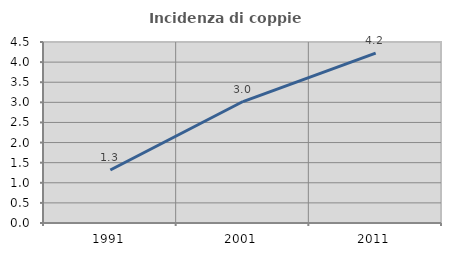
| Category | Incidenza di coppie miste |
|---|---|
| 1991.0 | 1.317 |
| 2001.0 | 3.02 |
| 2011.0 | 4.225 |